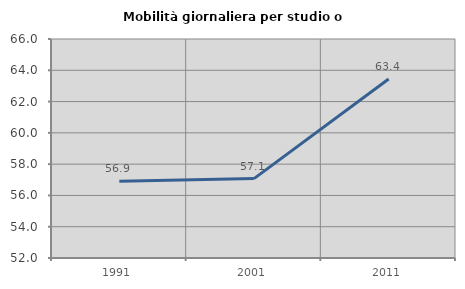
| Category | Mobilità giornaliera per studio o lavoro |
|---|---|
| 1991.0 | 56.909 |
| 2001.0 | 57.076 |
| 2011.0 | 63.444 |